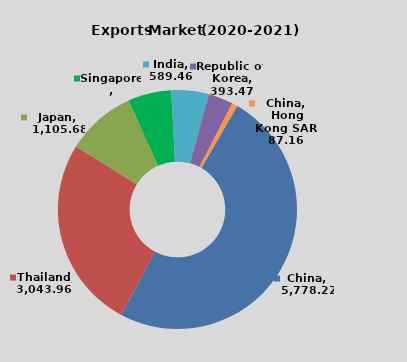
| Category | Series 0 |
|---|---|
| China | 5778.22 |
| Thailand | 3043.96 |
| Japan | 1105.68 |
| Singapore | 684.83 |
| India | 589.46 |
| Republic of  Korea | 393.47 |
| China, Hong Kong SAR | 87.16 |